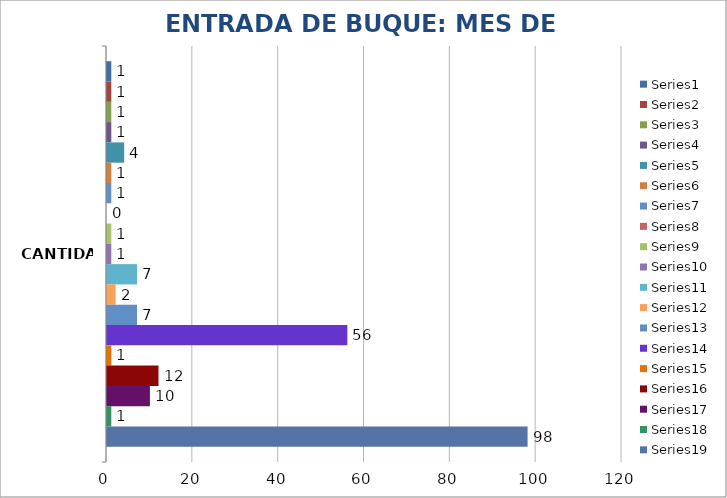
| Category | Series 0 | Series 1 | Series 2 | Series 3 | Series 4 | Series 5 | Series 6 | Series 7 | Series 8 | Series 9 | Series 10 | Series 11 | Series 12 | Series 13 | Series 14 | Series 15 | Series 16 | Series 17 | Series 18 |
|---|---|---|---|---|---|---|---|---|---|---|---|---|---|---|---|---|---|---|---|
| CANTIDAD | 1 | 1 | 1 | 1 | 4 | 1 | 1 | 0 | 1 | 1 | 7 | 2 | 7 | 56 | 1 | 12 | 10 | 1 | 98 |